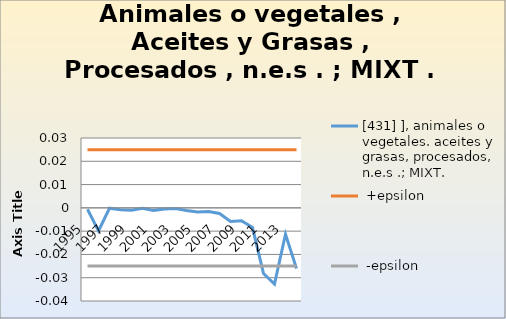
| Category | [431] ], animales o vegetales. aceites y grasas, procesados, n.e.s .; MIXT. |  +epsilon |  -epsilon |
|---|---|---|---|
| 1995.0 | -0.001 | 0.025 | -0.025 |
| 1996.0 | -0.01 | 0.025 | -0.025 |
| 1997.0 | 0 | 0.025 | -0.025 |
| 1998.0 | -0.001 | 0.025 | -0.025 |
| 1999.0 | -0.001 | 0.025 | -0.025 |
| 2000.0 | 0 | 0.025 | -0.025 |
| 2001.0 | -0.001 | 0.025 | -0.025 |
| 2002.0 | 0 | 0.025 | -0.025 |
| 2003.0 | 0 | 0.025 | -0.025 |
| 2004.0 | -0.001 | 0.025 | -0.025 |
| 2005.0 | -0.002 | 0.025 | -0.025 |
| 2006.0 | -0.002 | 0.025 | -0.025 |
| 2007.0 | -0.002 | 0.025 | -0.025 |
| 2008.0 | -0.006 | 0.025 | -0.025 |
| 2009.0 | -0.006 | 0.025 | -0.025 |
| 2010.0 | -0.008 | 0.025 | -0.025 |
| 2011.0 | -0.028 | 0.025 | -0.025 |
| 2012.0 | -0.033 | 0.025 | -0.025 |
| 2013.0 | -0.011 | 0.025 | -0.025 |
| 2014.0 | -0.026 | 0.025 | -0.025 |